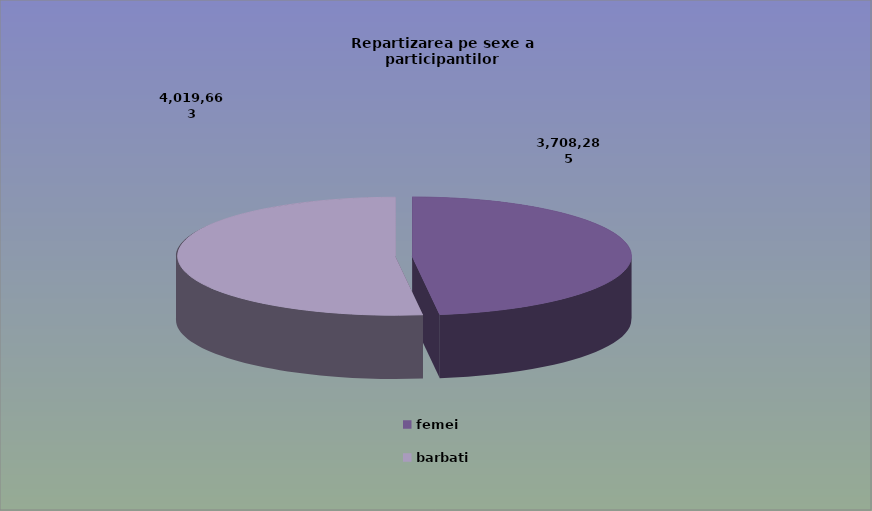
| Category | Series 0 |
|---|---|
| femei | 3708285 |
| barbati | 4019663 |